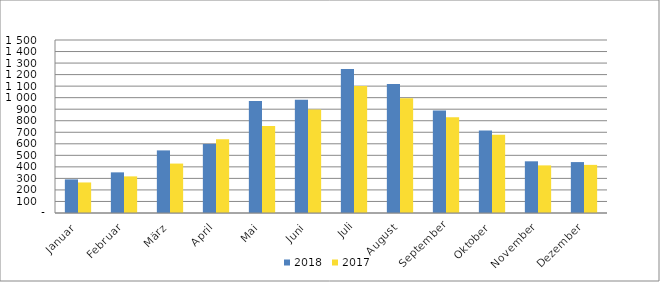
| Category | 2018 | 2017 |
|---|---|---|
| Januar | 291375 | 264826 |
| Februar | 352409 | 317453 |
| März | 542783 | 428573 |
| April | 598822 | 640026 |
| Mai | 970092 | 753521 |
| Juni | 981014 | 896995 |
| Juli | 1247752 | 1100643 |
| August | 1118902 | 994784 |
| September | 887790 | 830342 |
| Oktober | 714564 | 677910 |
| November | 448193 | 412819 |
| Dezember | 441494 | 417266 |